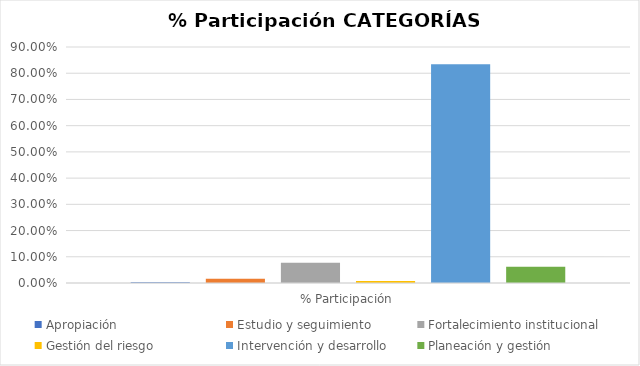
| Category | Apropiación | Estudio y seguimiento | Fortalecimiento institucional | Gestión del riesgo | Intervención y desarrollo | Planeación y gestión |
|---|---|---|---|---|---|---|
| % Participación | 0.003 | 0.016 | 0.077 | 0.008 | 0.835 | 0.062 |